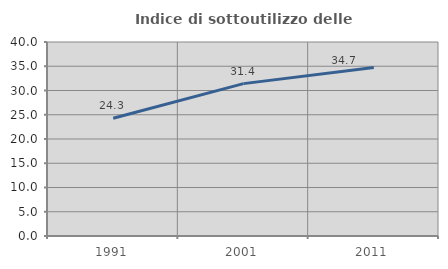
| Category | Indice di sottoutilizzo delle abitazioni  |
|---|---|
| 1991.0 | 24.287 |
| 2001.0 | 31.418 |
| 2011.0 | 34.727 |